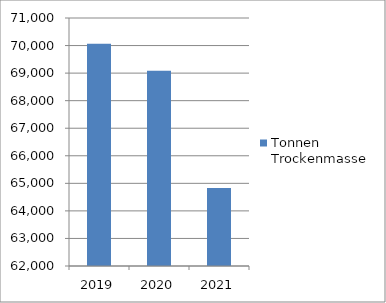
| Category | Tonnen Trockenmasse |
|---|---|
| 2019.0 | 70063 |
| 2020.0 | 69087 |
| 2021.0 | 64828 |